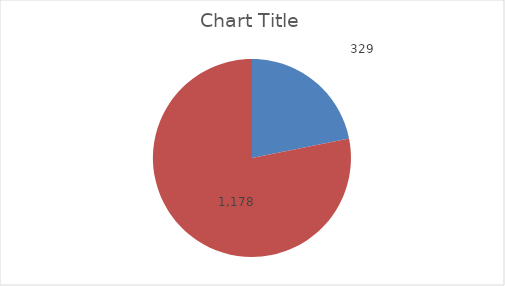
| Category | Series 0 |
|---|---|
| Conocidas  | 0.218 |
| Suspendidas  | 0.782 |